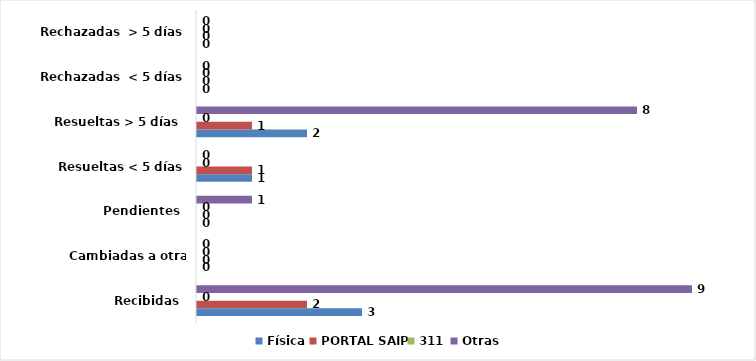
| Category | Física | PORTAL SAIP | 311 | Otras |
|---|---|---|---|---|
| Recibidas  | 3 | 2 | 0 | 9 |
| Cambiadas a otra institución | 0 | 0 | 0 | 0 |
| Pendientes  | 0 | 0 | 0 | 1 |
| Resueltas < 5 días | 1 | 1 | 0 | 0 |
| Resueltas > 5 días  | 2 | 1 | 0 | 8 |
| Rechazadas  < 5 días | 0 | 0 | 0 | 0 |
| Rechazadas  > 5 días | 0 | 0 | 0 | 0 |